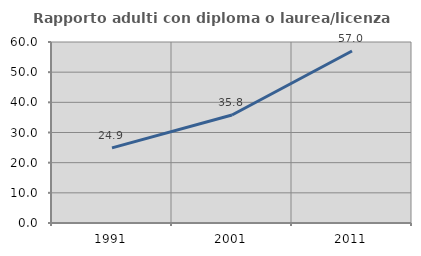
| Category | Rapporto adulti con diploma o laurea/licenza media  |
|---|---|
| 1991.0 | 24.906 |
| 2001.0 | 35.811 |
| 2011.0 | 57.026 |